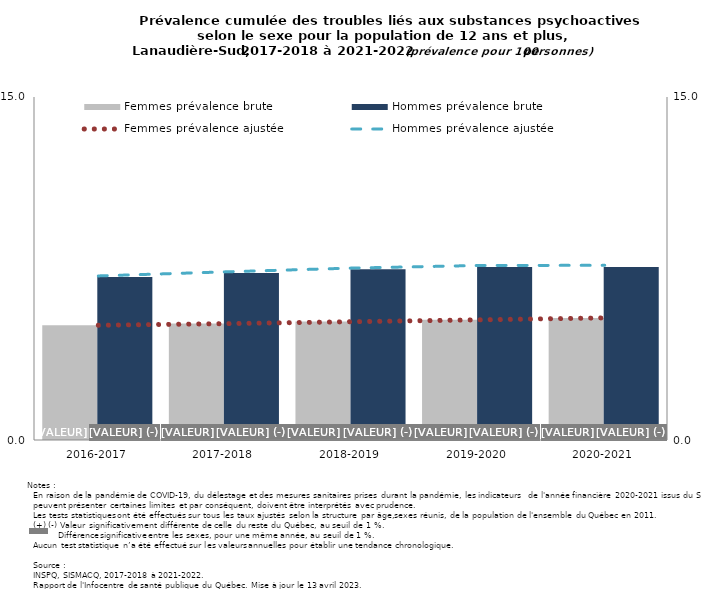
| Category | Femmes prévalence brute | Hommes prévalence brute |
|---|---|---|
| 2016-2017 | 5.022 | 7.123 |
| 2017-2018 | 5.093 | 7.302 |
| 2018-2019 | 5.18 | 7.468 |
| 2019-2020 | 5.256 | 7.566 |
| 2020-2021 | 5.337 | 7.56 |